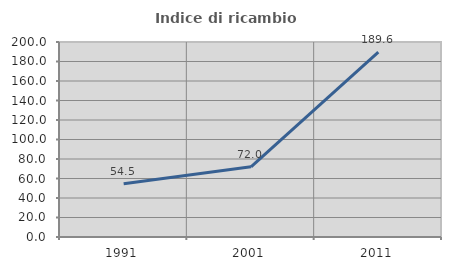
| Category | Indice di ricambio occupazionale  |
|---|---|
| 1991.0 | 54.502 |
| 2001.0 | 72.037 |
| 2011.0 | 189.575 |